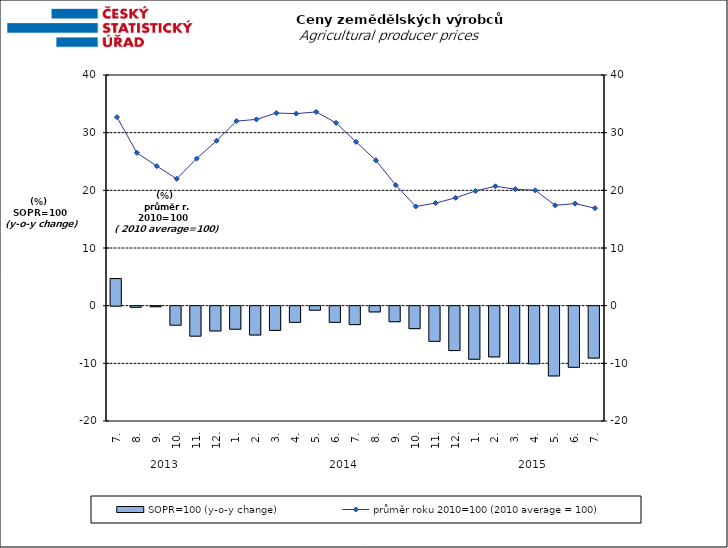
| Category | SOPR=100 (y-o-y change)   |
|---|---|
| 0 | 4.7 |
| 1 | -0.2 |
| 2 | -0.1 |
| 3 | -3.3 |
| 4 | -5.2 |
| 5 | -4.3 |
| 6 | -4 |
| 7 | -5 |
| 8 | -4.2 |
| 9 | -2.8 |
| 10 | -0.7 |
| 11 | -2.8 |
| 12 | -3.2 |
| 13 | -1 |
| 14 | -2.7 |
| 15 | -3.9 |
| 16 | -6.1 |
| 17 | -7.7 |
| 18 | -9.2 |
| 19 | -8.8 |
| 20 | -9.9 |
| 21 | -10 |
| 22 | -12.1 |
| 23 | -10.6 |
| 24 | -9 |